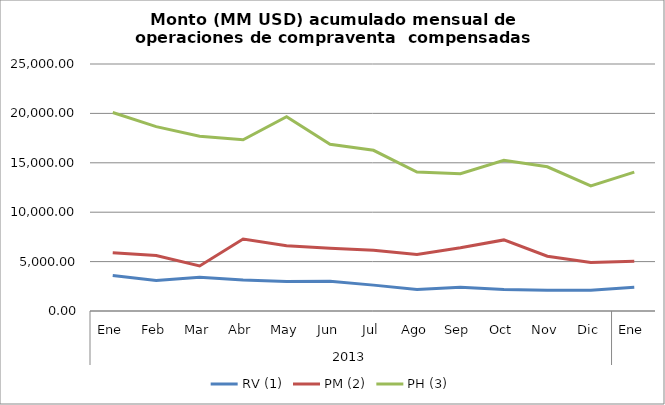
| Category | RV (1) | PM (2) | PH (3) |
|---|---|---|---|
| 0 | 3582.113 | 5901.651 | 20087.034 |
| 1 | 3086.223 | 5614.086 | 18662.914 |
| 2 | 3427.503 | 4559.027 | 17696.541 |
| 3 | 3146.302 | 7279.906 | 17332.385 |
| 4 | 2992.826 | 6596.857 | 19663.42 |
| 5 | 3012.804 | 6346.526 | 16878.408 |
| 6 | 2618.878 | 6139.885 | 16263.385 |
| 7 | 2182.732 | 5724.829 | 14069.305 |
| 8 | 2409.674 | 6399.577 | 13889.23 |
| 9 | 2180.079 | 7195.606 | 15254.774 |
| 10 | 2095.442 | 5541.836 | 14598.61 |
| 11 | 2104.88 | 4905.995 | 12657.524 |
| 12 | 2410.581 | 5047.1 | 14052.921 |